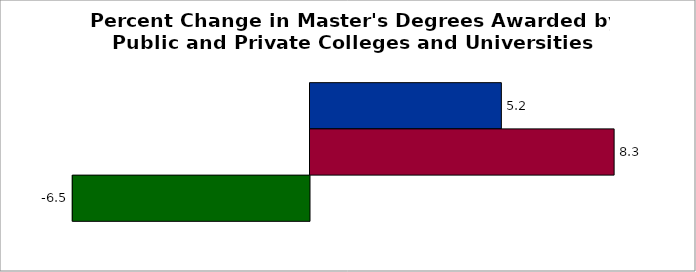
| Category | 50 states and D.C. | SREB states | State |
|---|---|---|---|
| 0 | 5.243 | 8.332 | -6.499 |